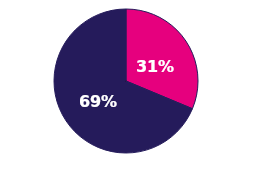
| Category | Series 0 |
|---|---|
| 0 | 0.313 |
| 1 | 0.687 |